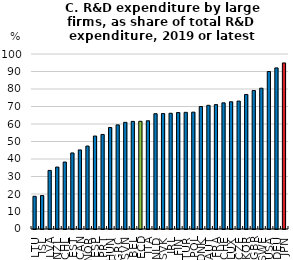
| Category | C. R&D expenditure by large firms % of total R&D expenditure, 2019 or latest |
|---|---|
| LTU | 18.671 |
| ISL | 19.135 |
| LVA | 33.477 |
| NZL | 35.397 |
| CHL | 38.255 |
| EST | 43.464 |
| CAN | 45.182 |
| NOR | 47.395 |
| ESP | 53.12 |
| PRT | 54.019 |
| HUN | 58.014 |
| GRC | 59.505 |
| SVN | 60.938 |
| BEL | 61.5 |
| OECD | 61.543 |
| ITA | 61.842 |
| NLD | 65.867 |
| SVK | 65.972 |
| IRL | 66.129 |
| FIN | 66.551 |
| TUR | 66.668 |
| POL | 66.775 |
| DNK | 70 |
| AUT | 70.674 |
| FRA | 71.066 |
| CHE | 72.081 |
| LUX | 72.711 |
| CZE | 73.085 |
| KOR | 76.879 |
| GBR | 79.147 |
| SWE | 80.45 |
| USA | 89.976 |
| DEU | 92.062 |
| JPN | 94.901 |